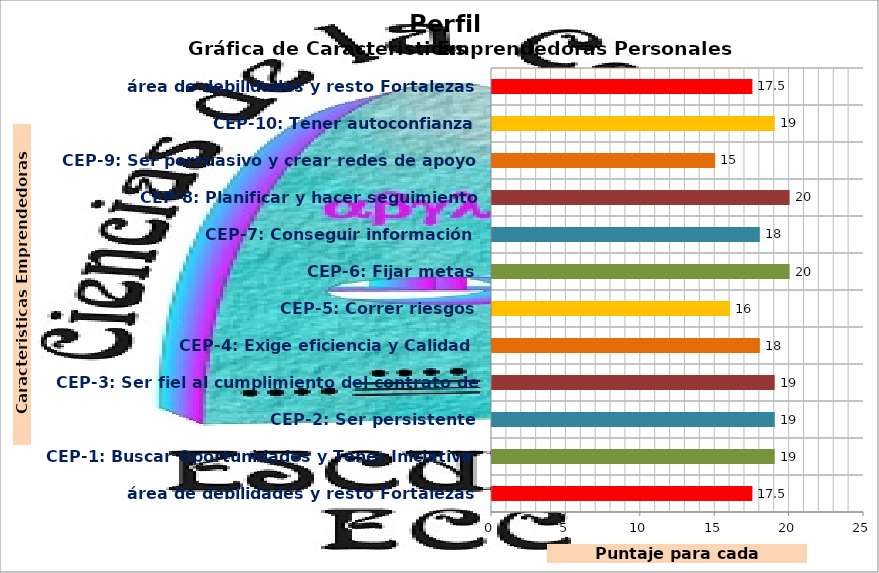
| Category | Series 0 |
|---|---|
| área de debilidades y resto Fortalezas | 17.5 |
| CEP-1: Buscar Oportunidades y Tener Iniciativa | 19 |
| CEP-2: Ser persistente | 19 |
| CEP-3: Ser fiel al cumplimiento del contrato de trabajo | 19 |
| CEP-4: Exige eficiencia y Calidad | 18 |
| CEP-5: Correr riesgos | 16 |
| CEP-6: Fijar metas | 20 |
| CEP-7: Conseguir información | 18 |
| CEP-8: Planificar y hacer seguimiento sistemático | 20 |
| CEP-9: Ser persuasivo y crear redes de apoyo | 15 |
| CEP-10: Tener autoconfianza | 19 |
| área de debilidades y resto Fortalezas | 17.5 |